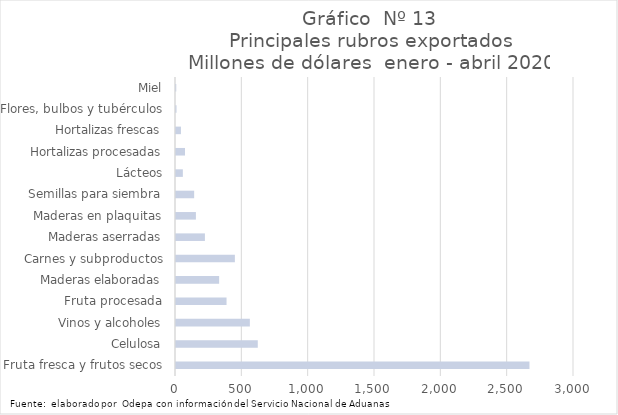
| Category | Series 7 |
|---|---|
| Fruta fresca y frutos secos | 2664350.091 |
| Celulosa | 616438.879 |
| Vinos y alcoholes | 556723.055 |
| Fruta procesada | 380976.28 |
| Maderas elaboradas | 325104.378 |
| Carnes y subproductos | 443809.962 |
| Maderas aserradas | 217956.21 |
| Maderas en plaquitas | 150012.096 |
| Semillas para siembra | 136802.728 |
| Lácteos | 51650.029 |
| Hortalizas procesadas | 67980.122 |
| Hortalizas frescas | 37224.675 |
| Flores, bulbos y tubérculos | 3917.976 |
| Miel | 1979.458 |